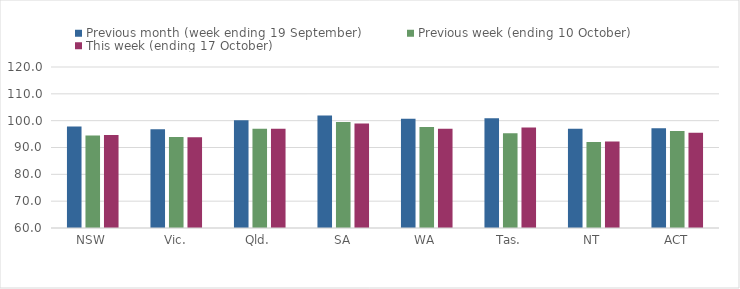
| Category | Previous month (week ending 19 September) | Previous week (ending 10 October) | This week (ending 17 October) |
|---|---|---|---|
| NSW | 97.81 | 94.48 | 94.62 |
| Vic. | 96.79 | 93.9 | 93.85 |
| Qld. | 100.13 | 97.01 | 97.03 |
| SA | 101.91 | 99.53 | 98.95 |
| WA | 100.73 | 97.64 | 97 |
| Tas. | 100.89 | 95.29 | 97.47 |
| NT | 96.99 | 92.03 | 92.21 |
| ACT | 97.2 | 96.11 | 95.47 |